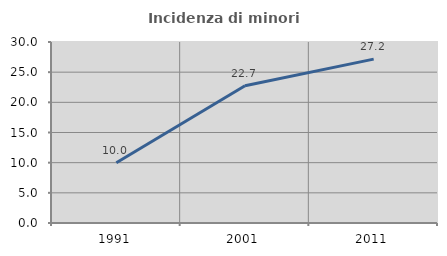
| Category | Incidenza di minori stranieri |
|---|---|
| 1991.0 | 10 |
| 2001.0 | 22.744 |
| 2011.0 | 27.158 |